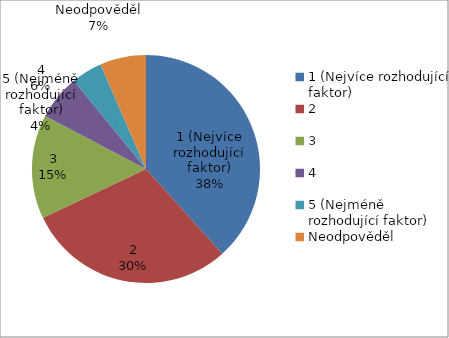
| Category | Series 0 |
|---|---|
| 1 (Nejvíce rozhodující faktor) | 317 |
| 2 | 245 |
| 3 | 122 |
| 4 | 53 |
| 5 (Nejméně rozhodující faktor) | 36 |
| Neodpověděl | 54 |